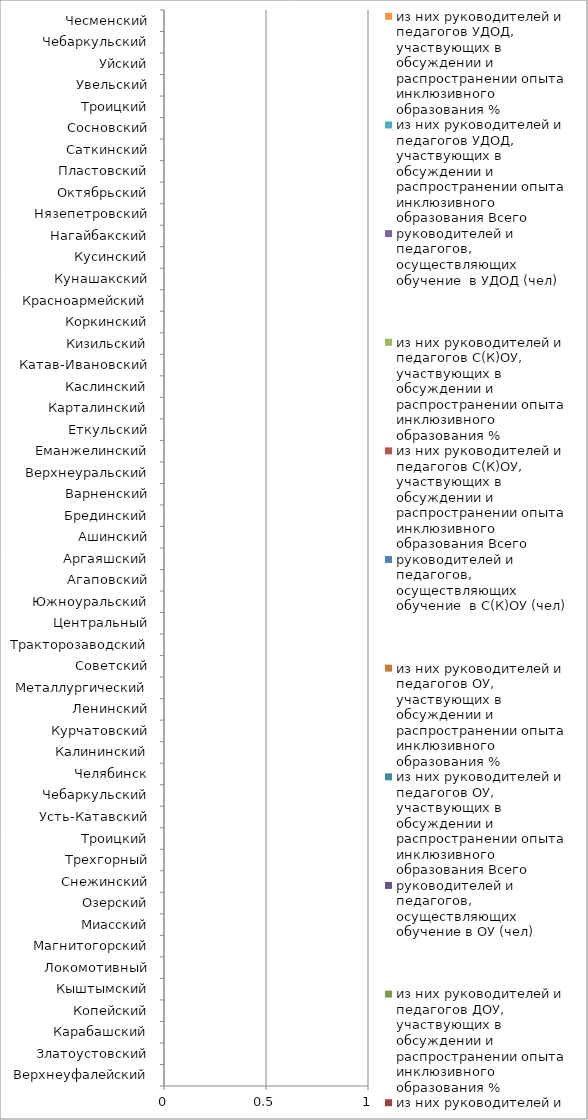
| Category | руководителей и педагогов, осуществляющих обучение в ДОУ (чел) | из них руководителей и педагогов ДОУ, участвующих в обсуждении и распространении опыта инклюзивного образования Всего | из них руководителей и педагогов ДОУ, участвующих в обсуждении и распространении опыта инклюзивного образования % | руководителей и педагогов, осуществляющих обучение в ОУ (чел) | из них руководителей и педагогов ОУ, участвующих в обсуждении и распространении опыта инклюзивного образования Всего | из них руководителей и педагогов ОУ, участвующих в обсуждении и распространении опыта инклюзивного образования % | руководителей и педагогов, осуществляющих обучение  в С(К)ОУ (чел) | из них руководителей и педагогов С(К)ОУ, участвующих в обсуждении и распространении опыта инклюзивного образования Всего | из них руководителей и педагогов С(К)ОУ, участвующих в обсуждении и распространении опыта инклюзивного образования % | руководителей и педагогов, осуществляющих обучение  в УДОД (чел) | из них руководителей и педагогов УДОД, участвующих в обсуждении и распространении опыта инклюзивного образования Всего | из них руководителей и педагогов УДОД, участвующих в обсуждении и распространении опыта инклюзивного образования % |
|---|---|---|---|---|---|---|---|---|---|---|---|---|
| Верхнеуфалейский | 0 | 0 | 0 | 0 | 0 | 0 | 0 | 0 | 0 | 0 | 0 | 0 |
| Златоустовский | 0 | 0 | 0 | 0 | 0 | 0 | 0 | 0 | 0 | 0 | 0 | 0 |
| Карабашский | 0 | 0 | 0 | 0 | 0 | 0 | 0 | 0 | 0 | 0 | 0 | 0 |
| Копейский | 0 | 0 | 0 | 0 | 0 | 0 | 0 | 0 | 0 | 0 | 0 | 0 |
| Кыштымский | 0 | 0 | 0 | 0 | 0 | 0 | 0 | 0 | 0 | 0 | 0 | 0 |
| Локомотивный | 0 | 0 | 0 | 0 | 0 | 0 | 0 | 0 | 0 | 0 | 0 | 0 |
| Магнитогорский | 0 | 0 | 0 | 0 | 0 | 0 | 0 | 0 | 0 | 0 | 0 | 0 |
| Миасский | 0 | 0 | 0 | 0 | 0 | 0 | 0 | 0 | 0 | 0 | 0 | 0 |
| Озерский | 0 | 0 | 0 | 0 | 0 | 0 | 0 | 0 | 0 | 0 | 0 | 0 |
| Снежинский | 0 | 0 | 0 | 0 | 0 | 0 | 0 | 0 | 0 | 0 | 0 | 0 |
| Трехгорный | 0 | 0 | 0 | 0 | 0 | 0 | 0 | 0 | 0 | 0 | 0 | 0 |
| Троицкий | 0 | 0 | 0 | 0 | 0 | 0 | 0 | 0 | 0 | 0 | 0 | 0 |
| Усть-Катавский | 0 | 0 | 0 | 0 | 0 | 0 | 0 | 0 | 0 | 0 | 0 | 0 |
| Чебаркульский | 0 | 0 | 0 | 0 | 0 | 0 | 0 | 0 | 0 | 0 | 0 | 0 |
| Челябинск | 0 | 0 | 0 | 0 | 0 | 0 | 0 | 0 | 0 | 0 | 0 | 0 |
| Калининский | 0 | 0 | 0 | 0 | 0 | 0 | 0 | 0 | 0 | 0 | 0 | 0 |
| Курчатовский | 0 | 0 | 0 | 0 | 0 | 0 | 0 | 0 | 0 | 0 | 0 | 0 |
| Ленинский | 0 | 0 | 0 | 0 | 0 | 0 | 0 | 0 | 0 | 0 | 0 | 0 |
| Металлургический | 0 | 0 | 0 | 0 | 0 | 0 | 0 | 0 | 0 | 0 | 0 | 0 |
| Советский | 0 | 0 | 0 | 0 | 0 | 0 | 0 | 0 | 0 | 0 | 0 | 0 |
| Тракторозаводский | 0 | 0 | 0 | 0 | 0 | 0 | 0 | 0 | 0 | 0 | 0 | 0 |
| Центральный | 0 | 0 | 0 | 0 | 0 | 0 | 0 | 0 | 0 | 0 | 0 | 0 |
| Южноуральский | 0 | 0 | 0 | 0 | 0 | 0 | 0 | 0 | 0 | 0 | 0 | 0 |
| Агаповский | 0 | 0 | 0 | 0 | 0 | 0 | 0 | 0 | 0 | 0 | 0 | 0 |
| Аргаяшский | 0 | 0 | 0 | 0 | 0 | 0 | 0 | 0 | 0 | 0 | 0 | 0 |
| Ашинский | 0 | 0 | 0 | 0 | 0 | 0 | 0 | 0 | 0 | 0 | 0 | 0 |
| Брединский | 0 | 0 | 0 | 0 | 0 | 0 | 0 | 0 | 0 | 0 | 0 | 0 |
| Варненский | 0 | 0 | 0 | 0 | 0 | 0 | 0 | 0 | 0 | 0 | 0 | 0 |
| Верхнеуральский | 0 | 0 | 0 | 0 | 0 | 0 | 0 | 0 | 0 | 0 | 0 | 0 |
| Еманжелинский | 0 | 0 | 0 | 0 | 0 | 0 | 0 | 0 | 0 | 0 | 0 | 0 |
| Еткульский | 0 | 0 | 0 | 0 | 0 | 0 | 0 | 0 | 0 | 0 | 0 | 0 |
| Карталинский | 0 | 0 | 0 | 0 | 0 | 0 | 0 | 0 | 0 | 0 | 0 | 0 |
| Каслинский | 0 | 0 | 0 | 0 | 0 | 0 | 0 | 0 | 0 | 0 | 0 | 0 |
| Катав-Ивановский | 0 | 0 | 0 | 0 | 0 | 0 | 0 | 0 | 0 | 0 | 0 | 0 |
| Кизильский | 0 | 0 | 0 | 0 | 0 | 0 | 0 | 0 | 0 | 0 | 0 | 0 |
| Коркинский | 0 | 0 | 0 | 0 | 0 | 0 | 0 | 0 | 0 | 0 | 0 | 0 |
| Красноармейский | 0 | 0 | 0 | 0 | 0 | 0 | 0 | 0 | 0 | 0 | 0 | 0 |
| Кунашакский | 0 | 0 | 0 | 0 | 0 | 0 | 0 | 0 | 0 | 0 | 0 | 0 |
| Кусинский | 0 | 0 | 0 | 0 | 0 | 0 | 0 | 0 | 0 | 0 | 0 | 0 |
| Нагайбакский | 0 | 0 | 0 | 0 | 0 | 0 | 0 | 0 | 0 | 0 | 0 | 0 |
| Нязепетровский | 0 | 0 | 0 | 0 | 0 | 0 | 0 | 0 | 0 | 0 | 0 | 0 |
| Октябрьский | 0 | 0 | 0 | 0 | 0 | 0 | 0 | 0 | 0 | 0 | 0 | 0 |
| Пластовский | 0 | 0 | 0 | 0 | 0 | 0 | 0 | 0 | 0 | 0 | 0 | 0 |
| Саткинский | 0 | 0 | 0 | 0 | 0 | 0 | 0 | 0 | 0 | 0 | 0 | 0 |
| Сосновский | 0 | 0 | 0 | 0 | 0 | 0 | 0 | 0 | 0 | 0 | 0 | 0 |
| Троицкий | 0 | 0 | 0 | 0 | 0 | 0 | 0 | 0 | 0 | 0 | 0 | 0 |
| Увельский | 0 | 0 | 0 | 0 | 0 | 0 | 0 | 0 | 0 | 0 | 0 | 0 |
| Уйский | 0 | 0 | 0 | 0 | 0 | 0 | 0 | 0 | 0 | 0 | 0 | 0 |
| Чебаркульский | 0 | 0 | 0 | 0 | 0 | 0 | 0 | 0 | 0 | 0 | 0 | 0 |
| Чесменский | 0 | 0 | 0 | 0 | 0 | 0 | 0 | 0 | 0 | 0 | 0 | 0 |